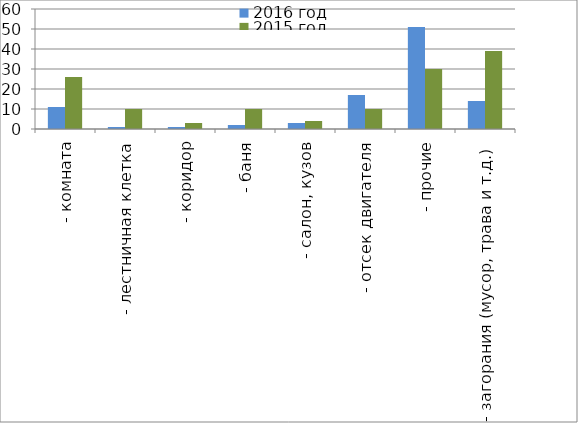
| Category | 2016 год | 2015 год |
|---|---|---|
|  - комната | 11 | 26 |
|  - лестничная клетка | 1 | 10 |
|  - коридор | 1 | 3 |
|  - баня | 2 | 10 |
|  - салон, кузов | 3 | 4 |
|  - отсек двигателя | 17 | 10 |
| - прочие | 51 | 30 |
| - загорания (мусор, трава и т.д.)  | 14 | 39 |